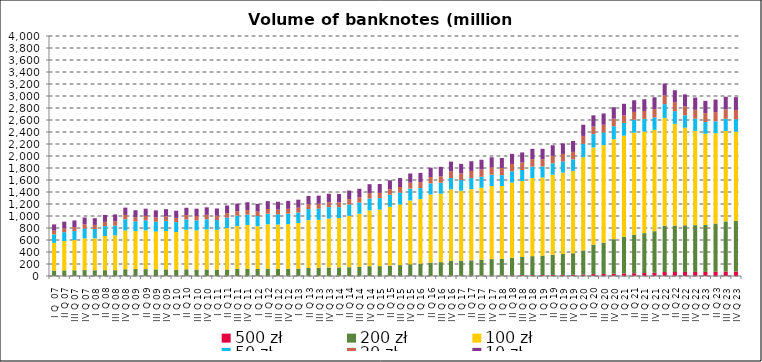
| Category | 500 zł | 200 zł | 100 zł | 50 zł | 20 zł | 10 zł |
|---|---|---|---|---|---|---|
| I Q  07 | 0 | 91.001 | 462.234 | 140.36 | 62.126 | 104.322 |
| II Q 07 | 0 | 94.017 | 486.917 | 149.194 | 66.329 | 109.005 |
| III Q 07 | 0 | 96.169 | 504.661 | 149.37 | 65.772 | 109.46 |
| IV Q 07 | 0 | 98.3 | 530.182 | 163.271 | 69.678 | 112.946 |
| I Q 08 | 0 | 96.171 | 532.757 | 154.361 | 68.334 | 112.132 |
| II Q 08 | 0 | 97.409 | 568.842 | 165.306 | 70.764 | 115.293 |
| III Q 08 | 0 | 96.952 | 580.66 | 162.993 | 70.416 | 115.453 |
| IV Q 08 | 0 | 112.825 | 647.845 | 184.171 | 73.705 | 120.567 |
| I Q 09 | 0 | 115.625 | 632.214 | 163.418 | 68.537 | 116.196 |
| II Q 09 | 0 | 115.081 | 645.212 | 169.12 | 71.877 | 120.173 |
| III Q 09 | 0 | 110.271 | 631.331 | 163.435 | 70.89 | 118.081 |
| IV Q 09 | 0 | 110.352 | 638.603 | 171.637 | 72.699 | 121.071 |
| I Q 10 | 0 | 105.48 | 627.443 | 164.629 | 71.047 | 119.914 |
| II Q 10 | 0 | 111.698 | 659.209 | 171.222 | 73.381 | 121.771 |
| III Q 10 | 0 | 108.007 | 652.727 | 166.44 | 73.148 | 121.62 |
| IV Q 10 | 0 | 109.577 | 666.755 | 168.709 | 74.552 | 124.744 |
| I Q 11 | 0 | 106.923 | 662.8 | 162.646 | 71.787 | 121.438 |
| II Q 11 | 0 | 108.435 | 689.987 | 174.472 | 75.278 | 126.885 |
| III Q 11 | 0 | 117.871 | 713.716 | 173.875 | 74.768 | 126.102 |
| IV Q 11 | 0 | 123.293 | 726.268 | 173.375 | 76.723 | 129.747 |
| I Q 12 | 0 | 116.827 | 713.777 | 168.049 | 74.779 | 128.594 |
| II Q 12 | 0 | 122.069 | 740.164 | 175.782 | 78.266 | 131.952 |
| III Q 12 | 0 | 120.232 | 738.234 | 170.997 | 77.745 | 130.575 |
| IV Q 12 | 0 | 121.466 | 741.31 | 175.971 | 80.414 | 133.368 |
| I Q 13 | 0 | 124.392 | 759.224 | 175.575 | 79.23 | 133.697 |
| II Q 13 | 0 | 134.668 | 795.413 | 186.02 | 81.65 | 135.997 |
| III Q 13 | 0 | 137.695 | 798.577 | 185.398 | 81.148 | 136.073 |
| IV Q 13 | 0 | 141.531 | 815.608 | 189.836 | 82.921 | 141.172 |
| I Q 14 | 0 | 142.242 | 823.405 | 181.078 | 80.364 | 138.808 |
| II Q 14 | 0 | 146.45 | 855.524 | 191.163 | 86.863 | 143.854 |
| III Q 14 | 0 | 152.181 | 885.272 | 186.703 | 86.859 | 142.716 |
| IV Q 14 | 0 | 163.516 | 931.155 | 196.477 | 89.792 | 149.403 |
| I Q 15 | 0 | 164.723 | 941.997 | 191.27 | 87.967 | 146.862 |
| II Q 15 | 0 | 173.193 | 981.125 | 199.521 | 91.17 | 150.121 |
| III Q 15 | 0 | 181.929 | 1010.61 | 197.622 | 93.325 | 148.821 |
| IV Q 15 | 0 | 196.377 | 1062.559 | 197.555 | 98.817 | 153.639 |
| I Q 16 | 0 | 205.711 | 1078.247 | 181.092 | 100.188 | 153.526 |
| II Q 16 | 0 | 222.582 | 1134.274 | 186.274 | 106.244 | 155.761 |
| III Q 16 | 0 | 230.808 | 1140.675 | 183.105 | 109.231 | 155.85 |
| IV Q 16 | 0 | 252.36 | 1192.527 | 187.932 | 111.972 | 161.443 |
| I Q 17 | 1.371 | 252.297 | 1168.049 | 179.14 | 109.401 | 158.992 |
| II Q 17 | 3.435 | 258.448 | 1185.043 | 184.698 | 119.165 | 161.781 |
| III Q 17 | 5.251 | 265.673 | 1199.907 | 183.982 | 121.007 | 161.681 |
| IV Q 17 | 7.228 | 274.575 | 1218.85 | 187.969 | 123.695 | 166.407 |
| I Q 18 | 8.596 | 278.62 | 1212.742 | 180.639 | 120.412 | 165.587 |
| II Q 18 | 10.598 | 293.455 | 1253.263 | 186.136 | 124.004 | 168.587 |
| III Q 18 | 12.264 | 303.951 | 1264.802 | 185.47 | 124.192 | 168.409 |
| IV Q 18 | 14.222 | 316.884 | 1302.09 | 190.168 | 123.213 | 173.346 |
| I Q 19 | 15.748 | 323.5 | 1302.531 | 183.931 | 121.252 | 173.302 |
| II Q 19 | 17.163 | 335.27 | 1335.557 | 188.647 | 125.194 | 177.008 |
| III Q 19 | 19.086 | 348.164 | 1357.328 | 185.39 | 124.09 | 175.753 |
| IV Q 19 | 20.846 | 358.747 | 1373.87 | 188.898 | 126.667 | 181.82 |
| I Q 20 | 25.676 | 400.955 | 1552.484 | 222.815 | 132.921 | 186.276 |
| II Q 20 | 31.313 | 491.305 | 1618.494 | 222.931 | 126.588 | 186.497 |
| III Q 20 | 33.861 | 523.452 | 1623.993 | 212.381 | 126.649 | 188.588 |
| IV Q 20 | 38.507 | 574.599 | 1665.94 | 216.954 | 126.177 | 190.607 |
| I Q 21 | 42.905 | 611.354 | 1684.65 | 212.889 | 126.061 | 192.313 |
| II Q 21 | 46.109 | 641.177 | 1704.034 | 212.973 | 130.622 | 194.027 |
| III Q 21 | 49.557 | 665.211 | 1692.414 | 211.42 | 132.015 | 194.953 |
| IV Q 21 | 53.381 | 693.732 | 1689.468 | 206.929 | 137.912 | 197.432 |
| I Q 22 | 65.954 | 773.67 | 1795.357 | 229.097 | 145.822 | 197.828 |
| II Q 22 | 66.319 | 774.546 | 1694.358 | 212.411 | 150.099 | 198.581 |
| III Q 22 | 67.664 | 777.591 | 1626.829 | 206.044 | 148.819 | 200.139 |
| IV Q 22 | 67.757 | 780.068 | 1571.94 | 202.406 | 148.354 | 203.915 |
| I Q 23 | 68.311 | 782.036 | 1521.362 | 194.016 | 148.409 | 205.077 |
| II Q 23 | 70.209 | 804.665 | 1505.337 | 197.507 | 153.97 | 209.496 |
| III Q 23 | 74.016 | 836.243 | 1507.611 | 202.444 | 156.02 | 211.217 |
| IV Q 23 | 74.927 | 846.794 | 1484.323 | 206.257 | 155.098 | 213.882 |